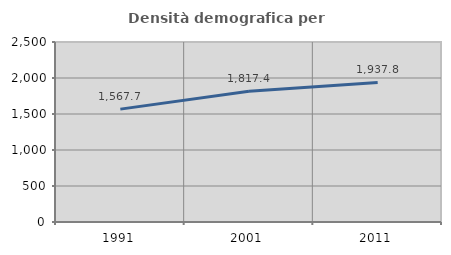
| Category | Densità demografica |
|---|---|
| 1991.0 | 1567.706 |
| 2001.0 | 1817.373 |
| 2011.0 | 1937.803 |